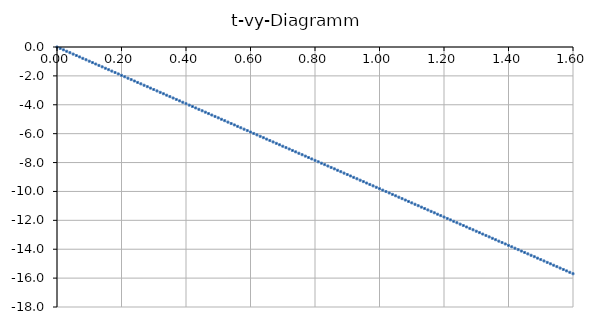
| Category | Series 0 |
|---|---|
| 0.0 | 0 |
| 0.01 | -0.098 |
| 0.02 | -0.196 |
| 0.03 | -0.294 |
| 0.04 | -0.392 |
| 0.05 | -0.49 |
| 0.06 | -0.589 |
| 0.07 | -0.687 |
| 0.08 | -0.785 |
| 0.09 | -0.883 |
| 0.1 | -0.981 |
| 0.11 | -1.079 |
| 0.12 | -1.177 |
| 0.13 | -1.275 |
| 0.14 | -1.373 |
| 0.15 | -1.472 |
| 0.16 | -1.57 |
| 0.17 | -1.668 |
| 0.18 | -1.766 |
| 0.19 | -1.864 |
| 0.2 | -1.962 |
| 0.21 | -2.06 |
| 0.22 | -2.158 |
| 0.23 | -2.256 |
| 0.24 | -2.354 |
| 0.25 | -2.452 |
| 0.26 | -2.551 |
| 0.27 | -2.649 |
| 0.28 | -2.747 |
| 0.29 | -2.845 |
| 0.3 | -2.943 |
| 0.31 | -3.041 |
| 0.32 | -3.139 |
| 0.33 | -3.237 |
| 0.34 | -3.335 |
| 0.35 | -3.434 |
| 0.36 | -3.532 |
| 0.37 | -3.63 |
| 0.38 | -3.728 |
| 0.39 | -3.826 |
| 0.4 | -3.924 |
| 0.41 | -4.022 |
| 0.42 | -4.12 |
| 0.43 | -4.218 |
| 0.44 | -4.316 |
| 0.45 | -4.414 |
| 0.46 | -4.513 |
| 0.47 | -4.611 |
| 0.48 | -4.709 |
| 0.49 | -4.807 |
| 0.5 | -4.905 |
| 0.51 | -5.003 |
| 0.52 | -5.101 |
| 0.53 | -5.199 |
| 0.54 | -5.297 |
| 0.55 | -5.396 |
| 0.56 | -5.494 |
| 0.57 | -5.592 |
| 0.58 | -5.69 |
| 0.59 | -5.788 |
| 0.6 | -5.886 |
| 0.61 | -5.984 |
| 0.62 | -6.082 |
| 0.63 | -6.18 |
| 0.64 | -6.278 |
| 0.65 | -6.376 |
| 0.66 | -6.475 |
| 0.67 | -6.573 |
| 0.68 | -6.671 |
| 0.69 | -6.769 |
| 0.7 | -6.867 |
| 0.71 | -6.965 |
| 0.72 | -7.063 |
| 0.73 | -7.161 |
| 0.74 | -7.259 |
| 0.75 | -7.357 |
| 0.76 | -7.456 |
| 0.77 | -7.554 |
| 0.78 | -7.652 |
| 0.790000000000001 | -7.75 |
| 0.8 | -7.848 |
| 0.810000000000001 | -7.946 |
| 0.82 | -8.044 |
| 0.83 | -8.142 |
| 0.84 | -8.24 |
| 0.850000000000001 | -8.338 |
| 0.860000000000001 | -8.437 |
| 0.87 | -8.535 |
| 0.88 | -8.633 |
| 0.890000000000001 | -8.731 |
| 0.900000000000001 | -8.829 |
| 0.910000000000001 | -8.927 |
| 0.92 | -9.025 |
| 0.930000000000001 | -9.123 |
| 0.940000000000001 | -9.221 |
| 0.950000000000001 | -9.319 |
| 0.960000000000001 | -9.418 |
| 0.970000000000001 | -9.516 |
| 0.980000000000001 | -9.614 |
| 0.990000000000001 | -9.712 |
| 1.0 | -9.81 |
| 1.01 | -9.908 |
| 1.02 | -10.006 |
| 1.03 | -10.104 |
| 1.04 | -10.202 |
| 1.05 | -10.3 |
| 1.06 | -10.399 |
| 1.07 | -10.497 |
| 1.08 | -10.595 |
| 1.09 | -10.693 |
| 1.1 | -10.791 |
| 1.11 | -10.889 |
| 1.12 | -10.987 |
| 1.13 | -11.085 |
| 1.14 | -11.183 |
| 1.15 | -11.282 |
| 1.16 | -11.38 |
| 1.17 | -11.478 |
| 1.18 | -11.576 |
| 1.19 | -11.674 |
| 1.2 | -11.772 |
| 1.21 | -11.87 |
| 1.22 | -11.968 |
| 1.23 | -12.066 |
| 1.24 | -12.164 |
| 1.25 | -12.262 |
| 1.26 | -12.361 |
| 1.27 | -12.459 |
| 1.28 | -12.557 |
| 1.29 | -12.655 |
| 1.3 | -12.753 |
| 1.31 | -12.851 |
| 1.32 | -12.949 |
| 1.33 | -13.047 |
| 1.34 | -13.145 |
| 1.35 | -13.244 |
| 1.36 | -13.342 |
| 1.37 | -13.44 |
| 1.38 | -13.538 |
| 1.39 | -13.636 |
| 1.4 | -13.734 |
| 1.41 | -13.832 |
| 1.42 | -13.93 |
| 1.43 | -14.028 |
| 1.44 | -14.126 |
| 1.45 | -14.224 |
| 1.46 | -14.323 |
| 1.47 | -14.421 |
| 1.48 | -14.519 |
| 1.49 | -14.617 |
| 1.5 | -14.715 |
| 1.51 | -14.813 |
| 1.52 | -14.911 |
| 1.53 | -15.009 |
| 1.54 | -15.107 |
| 1.55 | -15.206 |
| 1.56 | -15.304 |
| 1.57 | -15.402 |
| 1.58 | -15.5 |
| 1.59 | -15.598 |
| 1.6 | -15.696 |